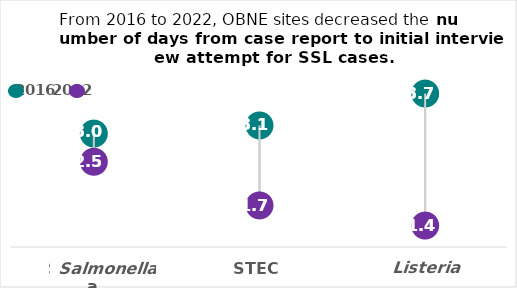
| Category | 2016 | 2022 |
|---|---|---|
| Salmonella | 2.978 | 2.487 |
| STEC | 3.12 | 1.725 |
| Listeria | 3.676 | 1.374 |